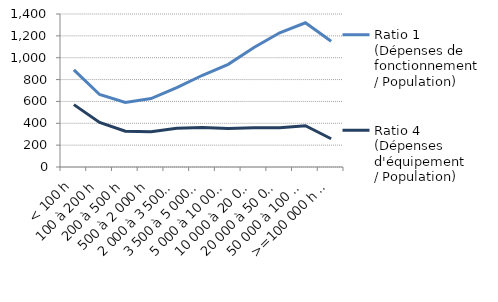
| Category | Ratio 1 
(Dépenses de fonctionnement 
/ Population) | Ratio 4 
(Dépenses d'équipement 
/ Population) |
|---|---|---|
| < 100 h | 888.798 | 570.736 |
| 100 à 200 h | 663.464 | 407.52 |
| 200 à 500 h | 590.034 | 326.871 |
| 500 à 2 000 h | 626.214 | 323.258 |
| 2 000 à 3 500 h | 725.651 | 354.432 |
| 3 500 à 5 000 h | 839.472 | 360.952 |
| 5 000 à 10 000 h | 939.411 | 353.042 |
| 10 000 à 20 000 h | 1093.189 | 358.315 |
| 20 000 à 50 000 h | 1227.92 | 358.399 |
| 50 000 à 100 000 h | 1319.696 | 377.551 |
| >=100 000 h hors Paris | 1151.01 | 258.502 |